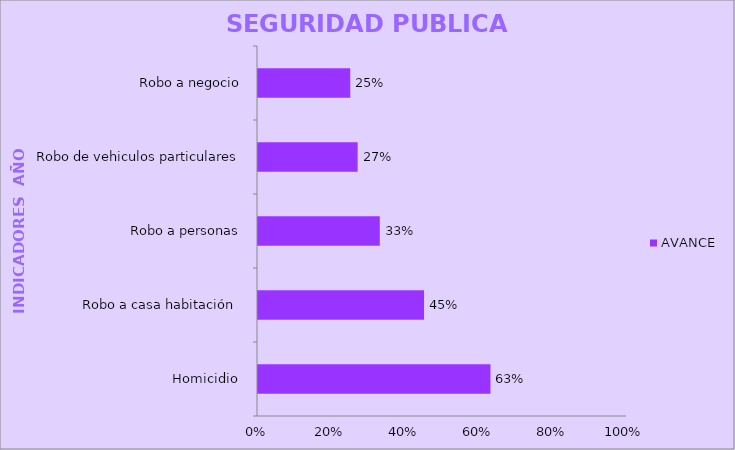
| Category | AVANCE |
|---|---|
| Homicidio  | 0.63 |
| Robo a casa habitación  | 0.45 |
| Robo a personas | 0.33 |
| Robo de vehiculos particulares | 0.27 |
| Robo a negocio | 0.25 |